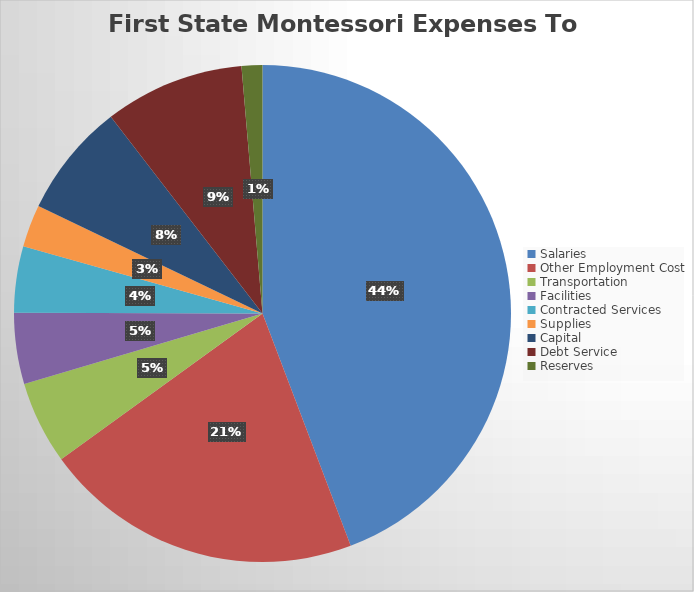
| Category | Series 0 |
|---|---|
| Salaries | 3278088.24 |
| Other Employment Cost | 1541759.12 |
| Transportation | 400118.79 |
| Facilities | 343054.07 |
| Contracted Services | 319502.44 |
| Supplies | 204151.33 |
| Capital | 550939.15 |
| Debt Service | 674600 |
| Reserves | 100000 |